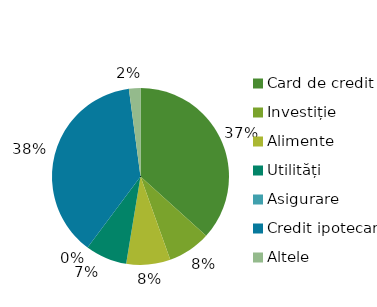
| Category | Total |
|---|---|
| Card de credit | 936.48 |
| Investiție | 200 |
| Alimente | 205.61 |
| Utilități | 194.2 |
| Asigurare | 0 |
| Credit ipotecar | 961.77 |
| Altele | 53.65 |